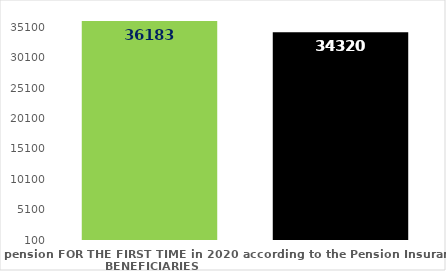
| Category | broj korisnika |
|---|---|
| Pension beneficiaries entitled to pension FOR THE FIRST TIME in 2020 according to the Pension Insurance Act  - NEW BENEFICIARIES | 36183 |
| Pension beneficiaries whose pension entitlement ceased in 2020  -  death caused,   
and who were retired according to the Pension Insurance Act   | 34320 |